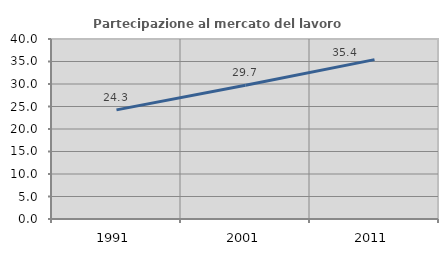
| Category | Partecipazione al mercato del lavoro  femminile |
|---|---|
| 1991.0 | 24.255 |
| 2001.0 | 29.711 |
| 2011.0 | 35.415 |